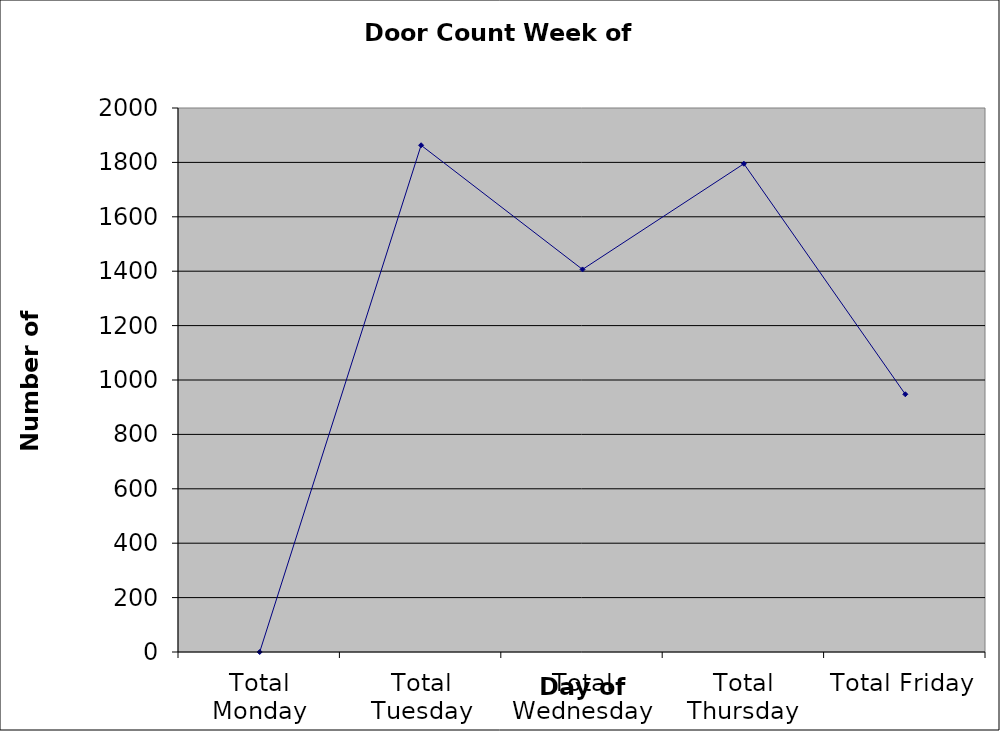
| Category | Series 0 |
|---|---|
| Total Monday | 0 |
| Total Tuesday | 1863 |
| Total Wednesday | 1406.5 |
| Total Thursday | 1795 |
| Total Friday | 947.5 |